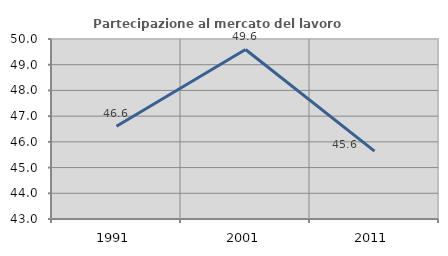
| Category | Partecipazione al mercato del lavoro  femminile |
|---|---|
| 1991.0 | 46.61 |
| 2001.0 | 49.593 |
| 2011.0 | 45.64 |